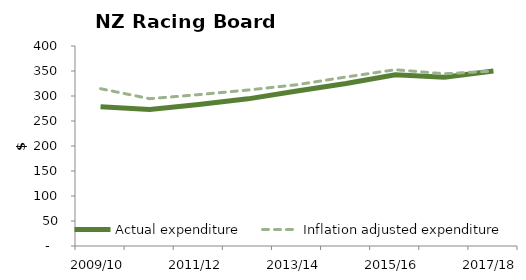
| Category | Actual expenditure | Inflation adjusted expenditure |
|---|---|---|
| 2009/10 | 278.393 | 314.584 |
| 2010/11 | 272.793 | 294.616 |
| 2011/12 | 282.951 | 302.758 |
| 2012/13 | 294.285 | 311.942 |
| 2013/14 | 310.171 | 322.578 |
| 2014/15 | 325.051 | 338.053 |
| 2015/16 | 342.291 | 352.56 |
| 2016/17 | 337.735 | 344.49 |
| 2017/18 | 349.868 | 349.868 |